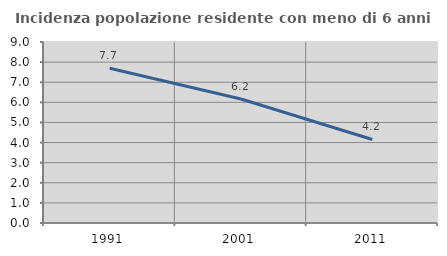
| Category | Incidenza popolazione residente con meno di 6 anni |
|---|---|
| 1991.0 | 7.692 |
| 2001.0 | 6.167 |
| 2011.0 | 4.153 |